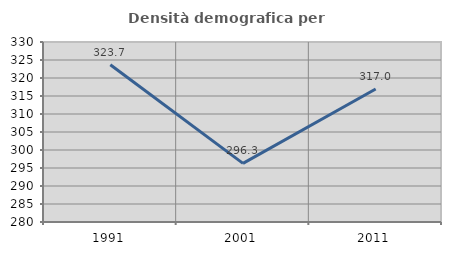
| Category | Densità demografica |
|---|---|
| 1991.0 | 323.681 |
| 2001.0 | 296.288 |
| 2011.0 | 316.962 |